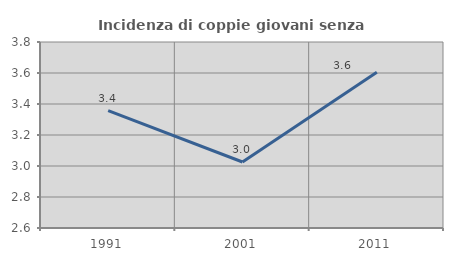
| Category | Incidenza di coppie giovani senza figli |
|---|---|
| 1991.0 | 3.358 |
| 2001.0 | 3.026 |
| 2011.0 | 3.605 |